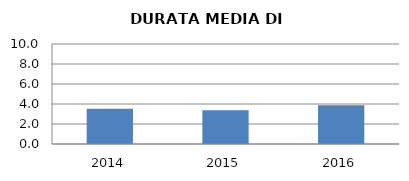
| Category | 2014 2015 2016 |
|---|---|
| 2014.0 | 3.529 |
| 2015.0 | 3.386 |
| 2016.0 | 3.887 |